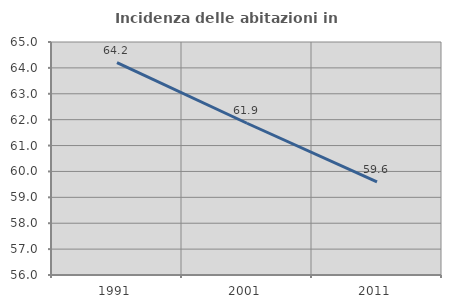
| Category | Incidenza delle abitazioni in proprietà  |
|---|---|
| 1991.0 | 64.206 |
| 2001.0 | 61.862 |
| 2011.0 | 59.6 |